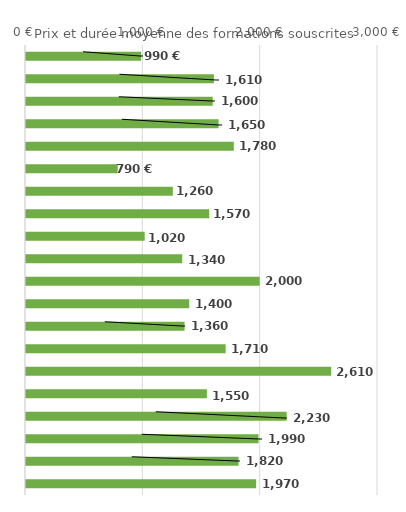
| Category | Series 0 |
|---|---|
| Transport, manutention, magasinage | 990 |
| Développement des capacités d'orientation, d'insertion ou de réinsertion | 1610 |
| Langues vivantes, civilisations étrangères et régionales | 1600 |
| Secrétariat, bureautique | 1650 |
| Informatique, traitement de l'information, réseaux de transmission des données | 1780 |
| Sécurité des biens et des personnes, police, surveillance | 790 |
| Coiffure, esthétique et autres spécialités des services aux personnes | 1260 |
| Enseignement, formation | 1570 |
| Agro-alimentaire, alimentation, cuisine | 1020 |
| Spécialités plurivalentes des échanges et de la gestion | 1340 |
| Spécialités plurivalentes des services à la collectivité | 2000 |
| Finances, banque, assurances | 1400 |
| Spécialités pluritechnologiques, génie civil, construction, bois | 1360 |
| Commerce, vente | 1710 |
| Ressources humaines, gestion du personnel, gestion de l'emploi | 2610 |
| Comptabilité, gestion | 1550 |
| Travail social | 2230 |
| Spécialités plurivalentes sanitaires et sociales | 1990 |
| Santé | 1820 |
| Spécialité plurivalentes de la communication | 1970 |